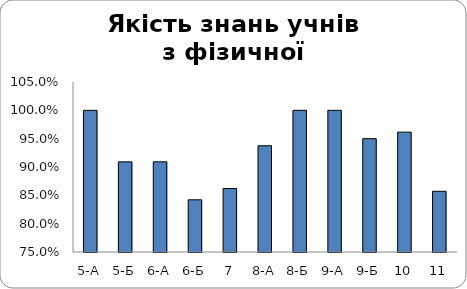
| Category | Series 0 |
|---|---|
| 5-А | 1 |
| 5-Б | 0.909 |
| 6-А | 0.909 |
| 6-Б | 0.842 |
| 7 | 0.862 |
| 8-А | 0.938 |
| 8-Б | 1 |
| 9-А | 1 |
| 9-Б | 0.95 |
| 10 | 0.962 |
| 11 | 0.857 |